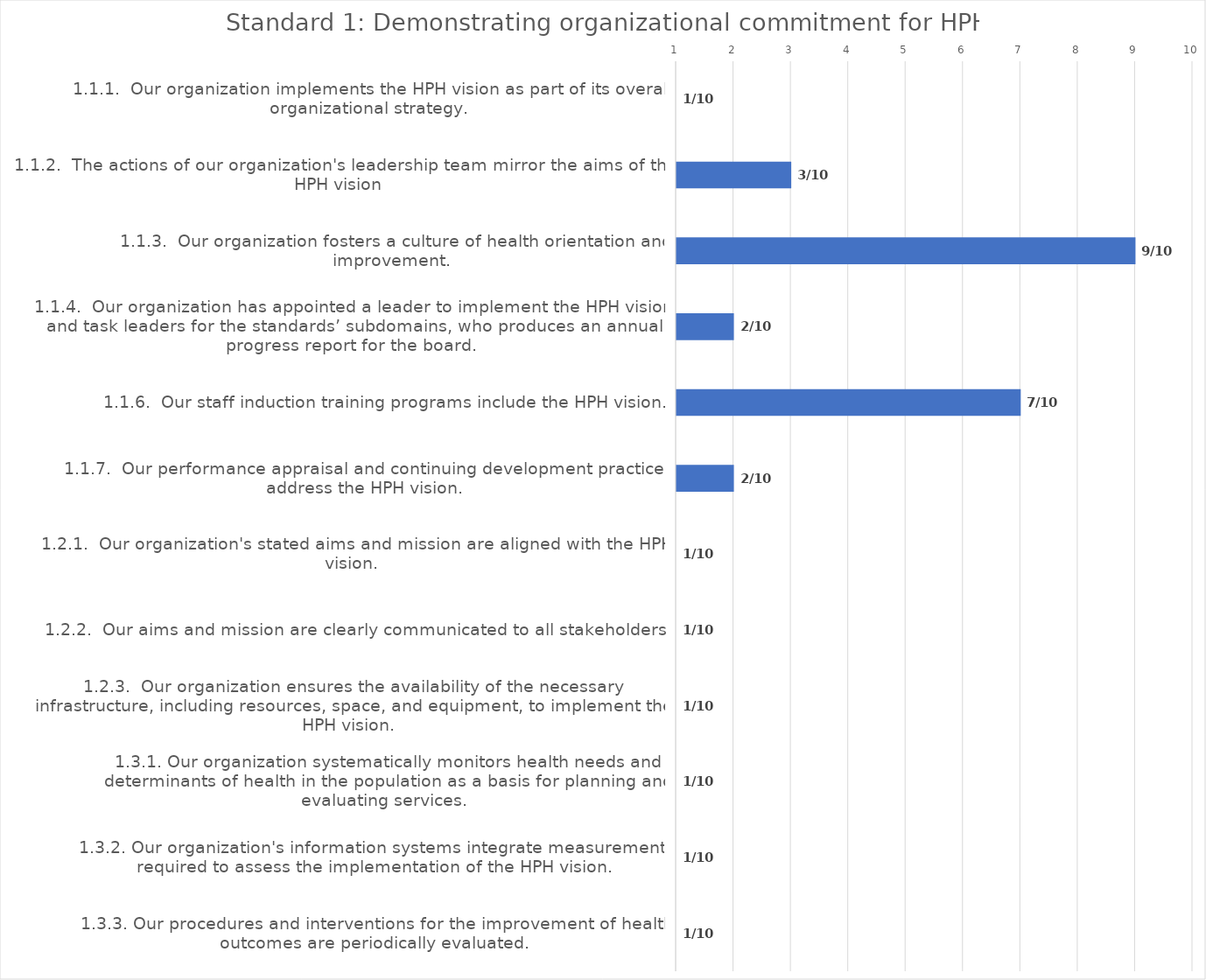
| Category | value |
|---|---|
| 1.1.1.  Our organization implements the HPH vision as part of its overall organizational strategy. | 1 |
| 1.1.2.  The actions of our organization's leadership team mirror the aims of the HPH vision | 3 |
| 1.1.3.  Our organization fosters a culture of health orientation and improvement. | 9 |
| 1.1.4.  Our organization has appointed a leader to implement the HPH vision and task leaders for the standards’ subdomains, who produces an annual progress report for the board. | 2 |
| 1.1.6.  Our staff induction training programs include the HPH vision. | 7 |
| 1.1.7.  Our performance appraisal and continuing development practices address the HPH vision. | 2 |
| 1.2.1.  Our organization's stated aims and mission are aligned with the HPH vision. | 1 |
| 1.2.2.  Our aims and mission are clearly communicated to all stakeholders. | 1 |
| 1.2.3.  Our organization ensures the availability of the necessary infrastructure, including resources, space, and equipment, to implement the HPH vision. | 1 |
| 1.3.1. Our organization systematically monitors health needs and determinants of health in the population as a basis for planning and evaluating services. | 1 |
| 1.3.2. Our organization's information systems integrate measurements required to assess the implementation of the HPH vision. | 1 |
| 1.3.3. Our procedures and interventions for the improvement of health outcomes are periodically evaluated. | 1 |